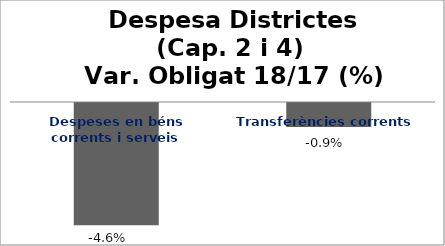
| Category | Series 0 |
|---|---|
| Despeses en béns corrents i serveis | -0.046 |
| Transferències corrents | -0.009 |